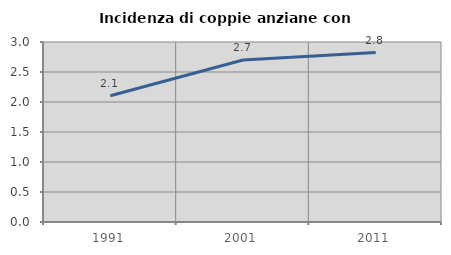
| Category | Incidenza di coppie anziane con figli |
|---|---|
| 1991.0 | 2.105 |
| 2001.0 | 2.701 |
| 2011.0 | 2.825 |